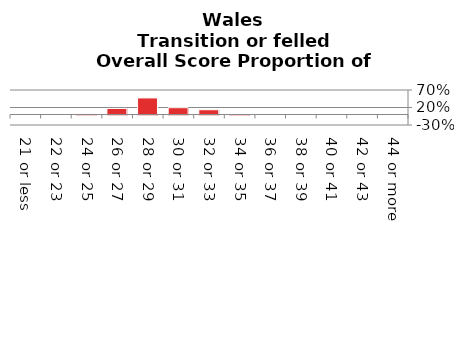
| Category | Transition or felled |
|---|---|
| 21 or less | 0 |
| 22 or 23 | 0 |
| 24 or 25 | 0.016 |
| 26 or 27 | 0.174 |
| 28 or 29 | 0.473 |
| 30 or 31 | 0.194 |
| 32 or 33 | 0.136 |
| 34 or 35 | 0.007 |
| 36 or 37 | 0 |
| 38 or 39 | 0 |
| 40 or 41 | 0 |
| 42 or 43 | 0 |
| 44 or more | 0 |